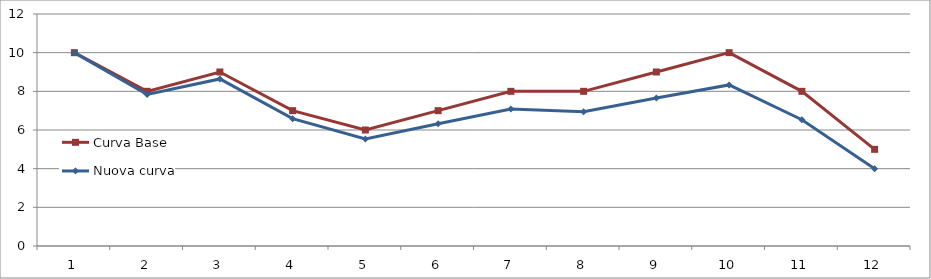
| Category | Curva Base | Nuova curva |
|---|---|---|
| 0 | 10 | 10 |
| 1 | 8 | 7.839 |
| 2 | 9 | 8.642 |
| 3 | 7 | 6.587 |
| 4 | 6 | 5.532 |
| 5 | 7 | 6.325 |
| 6 | 8 | 7.083 |
| 7 | 8 | 6.941 |
| 8 | 9 | 7.652 |
| 9 | 10 | 8.331 |
| 10 | 8 | 6.531 |
| 11 | 5 | 4 |